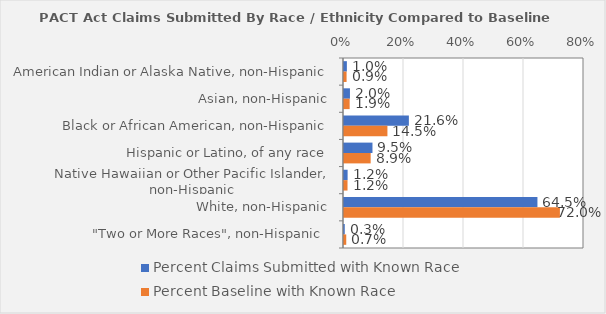
| Category | Percent Claims Submitted with Known Race | Percent Baseline with Known Race |
|---|---|---|
| American Indian or Alaska Native, non-Hispanic | 0.01 | 0.009 |
| Asian, non-Hispanic | 0.02 | 0.019 |
| Black or African American, non-Hispanic | 0.216 | 0.145 |
| Hispanic or Latino, of any race | 0.095 | 0.089 |
| Native Hawaiian or Other Pacific Islander, non-Hispanic | 0.012 | 0.012 |
| White, non-Hispanic | 0.645 | 0.72 |
| "Two or More Races", non-Hispanic  | 0.003 | 0.007 |